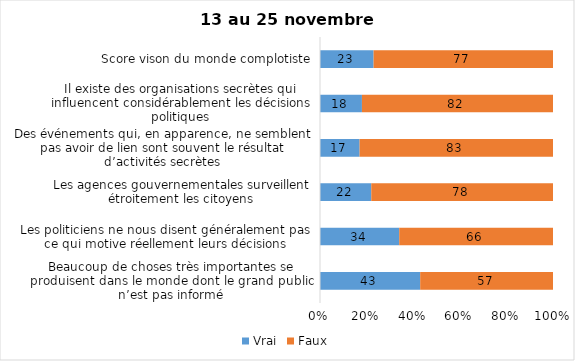
| Category | Vrai | Faux |
|---|---|---|
| Beaucoup de choses très importantes se produisent dans le monde dont le grand public n’est pas informé | 43 | 57 |
| Les politiciens ne nous disent généralement pas ce qui motive réellement leurs décisions | 34 | 66 |
| Les agences gouvernementales surveillent étroitement les citoyens | 22 | 78 |
| Des événements qui, en apparence, ne semblent pas avoir de lien sont souvent le résultat d’activités secrètes | 17 | 83 |
| Il existe des organisations secrètes qui influencent considérablement les décisions politiques | 18 | 82 |
| Score vison du monde complotiste | 23 | 77 |